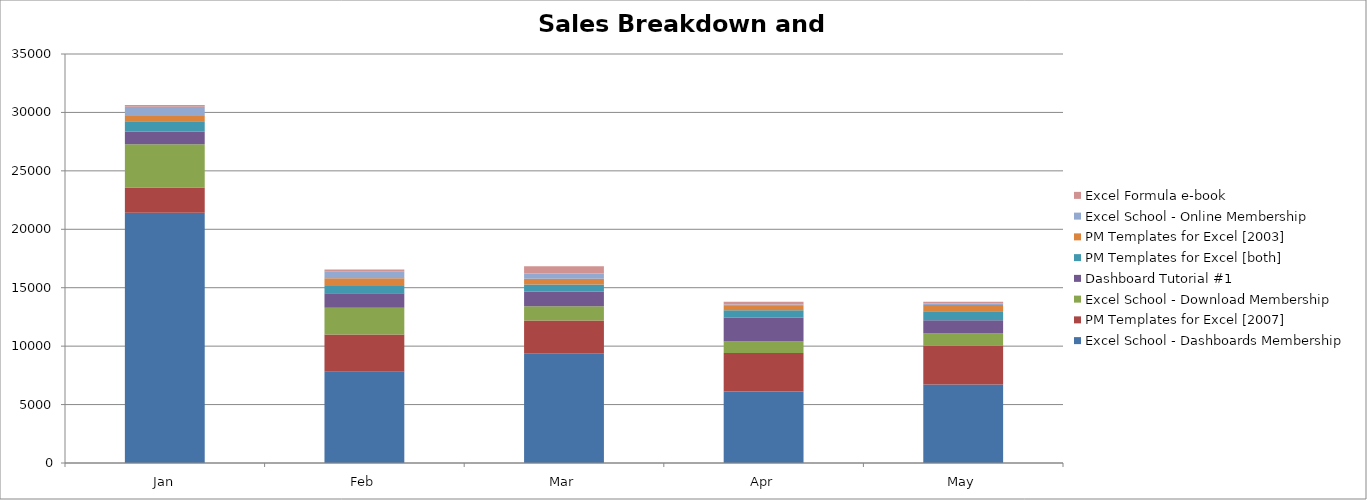
| Category | Excel School - Dashboards Membership | PM Templates for Excel [2007] | Excel School - Download Membership | Dashboard Tutorial #1 | PM Templates for Excel [both] | PM Templates for Excel [2003] | Excel School - Online Membership | Excel Formula e-book |
|---|---|---|---|---|---|---|---|---|
| Jan | 21417 | 2160 | 3696 | 1073 | 900 | 450 | 780 | 160 |
| Feb | 7812 | 3180 | 2300 | 1225 | 630 | 660 | 600 | 150 |
| Mar | 9400 | 2784 | 1222 | 1258 | 616 | 480 | 462 | 620 |
| Apr | 6112 | 3306 | 970 | 2052 | 630 | 360 | 134 | 240 |
| May | 6720 | 3335 | 1034 | 1125 | 765 | 540 | 134 | 150 |